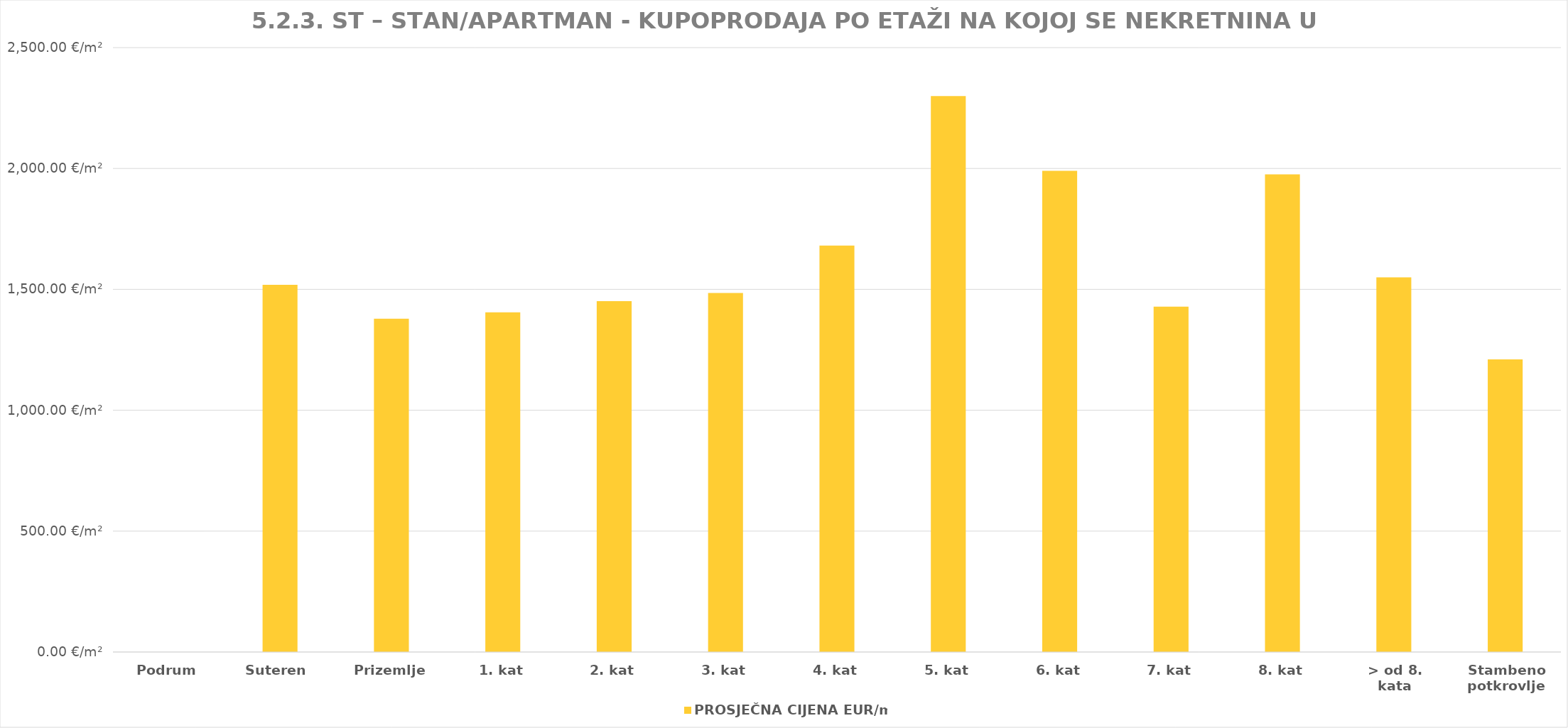
| Category | PROSJEČNA CIJENA EUR/m2 |
|---|---|
| Podrum | 0 |
| Suteren  | 1904-02-26 11:55:15 |
| Prizemlje | 1903-10-09 06:57:11 |
| 1. kat | 1903-11-05 02:43:24 |
| 2. kat | 1903-12-20 23:58:35 |
| 3. kat | 1904-01-23 23:11:49 |
| 4. kat | 1904-08-06 23:43:56 |
| 5. kat | 1906-04-17 06:09:08 |
| 6. kat | 1905-06-12 12:57:55 |
| 7. kat | 1903-11-28 02:38:28 |
| 8. kat | 1905-05-28 16:10:38 |
| > od 8. kata | 1904-03-28 21:34:17 |
| Stambeno potkrovlje | 1903-04-24 05:28:16 |